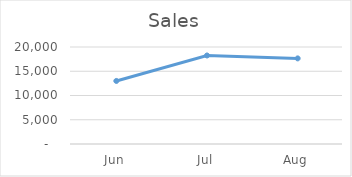
| Category | Sales |
|---|---|
| Jun | 13000 |
| Jul | 18252 |
| Aug | 17652 |